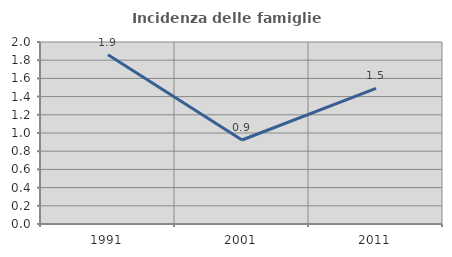
| Category | Incidenza delle famiglie numerose |
|---|---|
| 1991.0 | 1.859 |
| 2001.0 | 0.923 |
| 2011.0 | 1.491 |